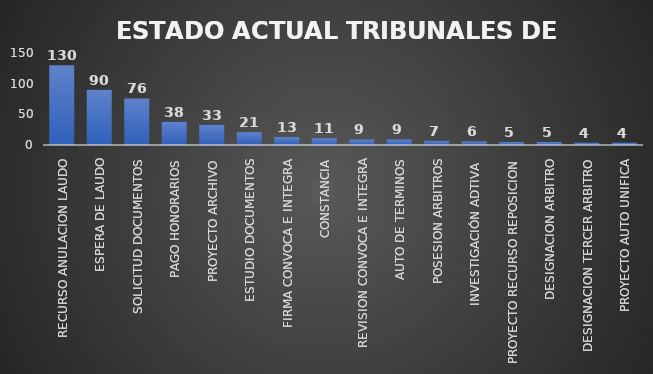
| Category | CANTIDAD | % |
|---|---|---|
| RECURSO ANULACION LAUDO | 130 | 0.279 |
| ESPERA DE LAUDO | 90 | 0.16 |
| SOLICITUD DOCUMENTOS | 76 | 0.162 |
| PAGO HONORARIOS | 38 | 0.075 |
| PROYECTO ARCHIVO | 33 | 0.076 |
| ESTUDIO DOCUMENTOS | 21 | 0.047 |
| FIRMA CONVOCA E INTEGRA | 13 | 0.036 |
| CONSTANCIA | 11 | 0.026 |
| REVISION CONVOCA E INTEGRA | 9 | 0.016 |
| AUTO DE TERMINOS | 9 | 0.02 |
| POSESION ARBITROS | 7 | 0.012 |
| INVESTIGACIÓN ADTIVA  | 6 | 0.013 |
| PROYECTO RECURSO REPOSICION | 5 | 0.009 |
| DESIGNACION ARBITRO | 5 | 0.016 |
| DESIGNACION TERCER ARBITRO | 4 | 0.012 |
| PROYECTO AUTO UNIFICA | 4 | 0.003 |